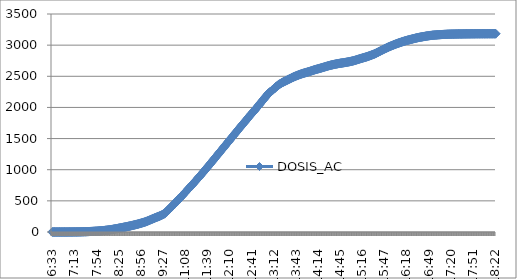
| Category | DOSIS_AC |
|---|---|
| 0.27291666666666664 | 0.014 |
| 0.2736111111111111 | 0.028 |
| 0.2743055555555555 | 0.042 |
| 0.275 | 0.056 |
| 0.27569444444444446 | 0.07 |
| 0.27638888888888885 | 0.084 |
| 0.27708333333333335 | 0.098 |
| 0.2777777777777778 | 0.112 |
| 0.27847222222222223 | 0.126 |
| 0.2791666666666667 | 0.14 |
| 0.2798611111111111 | 0.154 |
| 0.28055555555555556 | 0.182 |
| 0.28125 | 0.21 |
| 0.28194444444444444 | 0.238 |
| 0.2826388888888889 | 0.266 |
| 0.2833333333333333 | 0.294 |
| 0.28402777777777777 | 0.322 |
| 0.2847222222222222 | 0.349 |
| 0.28541666666666665 | 0.377 |
| 0.28611111111111115 | 0.419 |
| 0.2923611111111111 | 0.475 |
| 0.29305555555555557 | 0.545 |
| 0.29375 | 0.615 |
| 0.29444444444444445 | 0.685 |
| 0.2951388888888889 | 0.755 |
| 0.29583333333333334 | 0.839 |
| 0.2972222222222222 | 0.923 |
| 0.29791666666666666 | 1.021 |
| 0.2986111111111111 | 1.118 |
| 0.29930555555555555 | 1.23 |
| 0.3 | 1.342 |
| 0.30069444444444443 | 1.454 |
| 0.3013888888888889 | 1.58 |
| 0.3020833333333333 | 1.706 |
| 0.30277777777777776 | 1.831 |
| 0.3090277777777778 | 2.041 |
| 0.30972222222222223 | 2.265 |
| 0.3104166666666667 | 2.488 |
| 0.3111111111111111 | 2.726 |
| 0.31180555555555556 | 2.978 |
| 0.3125 | 3.243 |
| 0.31319444444444444 | 3.509 |
| 0.3138888888888889 | 3.789 |
| 0.3145833333333333 | 4.082 |
| 0.31527777777777777 | 4.39 |
| 0.3159722222222222 | 4.711 |
| 0.31666666666666665 | 5.047 |
| 0.31736111111111115 | 5.396 |
| 0.31805555555555554 | 5.774 |
| 0.3201388888888889 | 6.193 |
| 0.32083333333333336 | 6.627 |
| 0.3215277777777778 | 7.074 |
| 0.32222222222222224 | 7.549 |
| 0.3229166666666667 | 8.052 |
| 0.3236111111111111 | 8.584 |
| 0.32430555555555557 | 9.143 |
| 0.325 | 9.73 |
| 0.32569444444444445 | 10.331 |
| 0.3263888888888889 | 10.96 |
| 0.32708333333333334 | 11.617 |
| 0.3277777777777778 | 12.302 |
| 0.3284722222222222 | 13.029 |
| 0.32916666666666666 | 13.784 |
| 0.3298611111111111 | 14.581 |
| 0.33055555555555555 | 15.406 |
| 0.33125 | 16.273 |
| 0.33194444444444443 | 17.181 |
| 0.3326388888888889 | 18.132 |
| 0.3333333333333333 | 19.125 |
| 0.3340277777777778 | 20.173 |
| 0.3347222222222222 | 21.264 |
| 0.3354166666666667 | 22.396 |
| 0.3361111111111111 | 23.57 |
| 0.3368055555555556 | 24.787 |
| 0.3375 | 26.045 |
| 0.33819444444444446 | 27.359 |
| 0.33888888888888885 | 28.715 |
| 0.33958333333333335 | 30.113 |
| 0.34027777777777773 | 31.553 |
| 0.34097222222222223 | 33.063 |
| 0.3416666666666666 | 34.656 |
| 0.3423611111111111 | 36.32 |
| 0.3430555555555555 | 38.054 |
| 0.34375 | 39.843 |
| 0.3444444444444445 | 41.702 |
| 0.3451388888888889 | 43.618 |
| 0.3458333333333334 | 45.575 |
| 0.34652777777777777 | 47.574 |
| 0.34722222222222227 | 49.601 |
| 0.34791666666666665 | 51.684 |
| 0.34861111111111115 | 53.823 |
| 0.34930555555555554 | 55.99 |
| 0.35 | 58.185 |
| 0.3506944444444444 | 60.422 |
| 0.3513888888888889 | 62.63 |
| 0.3520833333333333 | 64.839 |
| 0.3527777777777778 | 67.09 |
| 0.3534722222222222 | 69.383 |
| 0.3541666666666667 | 71.661 |
| 0.3548611111111111 | 73.884 |
| 0.35555555555555557 | 76.093 |
| 0.35625 | 78.316 |
| 0.35694444444444445 | 80.581 |
| 0.3576388888888889 | 82.915 |
| 0.35833333333333334 | 85.278 |
| 0.3590277777777778 | 87.683 |
| 0.3597222222222222 | 90.115 |
| 0.36041666666666666 | 92.548 |
| 0.3611111111111111 | 95.022 |
| 0.36180555555555555 | 97.594 |
| 0.3625 | 100.195 |
| 0.36319444444444443 | 102.865 |
| 0.3638888888888889 | 105.577 |
| 0.3645833333333333 | 108.331 |
| 0.3652777777777778 | 111.057 |
| 0.3659722222222222 | 113.783 |
| 0.3666666666666667 | 116.551 |
| 0.3673611111111111 | 119.375 |
| 0.3680555555555556 | 122.241 |
| 0.36875 | 125.135 |
| 0.36944444444444446 | 128.071 |
| 0.37013888888888885 | 131.188 |
| 0.37083333333333335 | 134.362 |
| 0.37152777777777773 | 137.577 |
| 0.37222222222222223 | 140.862 |
| 0.3729166666666666 | 144.288 |
| 0.3736111111111111 | 147.769 |
| 0.3743055555555555 | 151.18 |
| 0.375 | 154.633 |
| 0.3756944444444445 | 158.268 |
| 0.3763888888888889 | 162.238 |
| 0.3770833333333334 | 166.194 |
| 0.37777777777777777 | 170.598 |
| 0.37847222222222227 | 175.211 |
| 0.37916666666666665 | 179.853 |
| 0.37986111111111115 | 184.648 |
| 0.38055555555555554 | 189.513 |
| 0.38125 | 194.392 |
| 0.3819444444444444 | 199.187 |
| 0.3826388888888889 | 203.954 |
| 0.3833333333333333 | 208.805 |
| 0.3840277777777778 | 213.572 |
| 0.3847222222222222 | 218.424 |
| 0.3854166666666667 | 223.303 |
| 0.3861111111111111 | 227.776 |
| 0.38680555555555557 | 232.683 |
| 0.3875 | 237.227 |
| 0.38819444444444445 | 241.63 |
| 0.3888888888888889 | 245.992 |
| 0.38958333333333334 | 250.466 |
| 0.3902777777777778 | 255.093 |
| 0.3909722222222222 | 260.294 |
| 0.39166666666666666 | 265.62 |
| 0.3923611111111111 | 270.639 |
| 0.39305555555555555 | 276.496 |
| 0.39375 | 282.326 |
| 0.39444444444444443 | 287.806 |
| 0.3951388888888889 | 293.748 |
| 0.4444444444444444 | 304.75 |
| 0.4451388888888889 | 315.808 |
| 0.4458333333333333 | 326.908 |
| 0.4465277777777778 | 338.092 |
| 0.4472222222222222 | 349.36 |
| 0.4479166666666667 | 360.698 |
| 0.4486111111111111 | 372.064 |
| 0.44930555555555557 | 383.457 |
| 0.45 | 394.949 |
| 0.45069444444444445 | 406.468 |
| 0.4513888888888889 | 418.016 |
| 0.45208333333333334 | 429.633 |
| 0.4527777777777778 | 441.293 |
| 0.4534722222222222 | 452.994 |
| 0.45416666666666666 | 464.779 |
| 0.4548611111111111 | 476.62 |
| 0.45555555555555555 | 488.517 |
| 0.45625 | 500.47 |
| 0.45694444444444443 | 512.479 |
| 0.4576388888888889 | 524.558 |
| 0.4583333333333333 | 536.692 |
| 0.4590277777777778 | 548.855 |
| 0.4597222222222222 | 561.045 |
| 0.4604166666666667 | 573.278 |
| 0.4611111111111111 | 585.566 |
| 0.4618055555555556 | 597.855 |
| 0.4625 | 610.129 |
| 0.46319444444444446 | 622.459 |
| 0.46388888888888885 | 634.846 |
| 0.46458333333333335 | 647.288 |
| 0.46527777777777773 | 659.772 |
| 0.46597222222222223 | 672.242 |
| 0.4666666666666666 | 684.712 |
| 0.4673611111111111 | 697.141 |
| 0.4680555555555555 | 709.541 |
| 0.46875 | 721.997 |
| 0.4694444444444445 | 734.551 |
| 0.4701388888888889 | 747.259 |
| 0.4708333333333334 | 760.051 |
| 0.47152777777777777 | 772.87 |
| 0.47222222222222227 | 785.676 |
| 0.47291666666666665 | 798.454 |
| 0.47361111111111115 | 811.217 |
| 0.47430555555555554 | 824.023 |
| 0.475 | 836.871 |
| 0.4756944444444444 | 849.774 |
| 0.4763888888888889 | 862.79 |
| 0.4770833333333333 | 875.903 |
| 0.4777777777777778 | 889.058 |
| 0.4784722222222222 | 902.185 |
| 0.4791666666666667 | 915.382 |
| 0.4798611111111111 | 928.719 |
| 0.48055555555555557 | 942.126 |
| 0.48125 | 955.589 |
| 0.48194444444444445 | 969.108 |
| 0.4826388888888889 | 982.696 |
| 0.48333333333333334 | 996.327 |
| 0.4840277777777778 | 1009.985 |
| 0.4847222222222222 | 1023.63 |
| 0.48541666666666666 | 1037.302 |
| 0.4861111111111111 | 1050.988 |
| 0.48680555555555555 | 1064.633 |
| 0.4875 | 1078.319 |
| 0.48819444444444443 | 1092.201 |
| 0.4888888888888889 | 1106.154 |
| 0.4895833333333333 | 1120.078 |
| 0.4902777777777778 | 1134.016 |
| 0.4909722222222222 | 1147.996 |
| 0.4916666666666667 | 1161.976 |
| 0.4923611111111111 | 1175.956 |
| 0.4930555555555556 | 1189.936 |
| 0.49375 | 1203.916 |
| 0.49444444444444446 | 1217.896 |
| 0.49513888888888885 | 1231.876 |
| 0.49583333333333335 | 1245.856 |
| 0.49652777777777773 | 1259.836 |
| 0.49722222222222223 | 1273.816 |
| 0.4979166666666666 | 1287.796 |
| 0.4986111111111111 | 1301.776 |
| 0.4993055555555555 | 1315.756 |
| 0.5 | 1329.736 |
| 0.5006944444444444 | 1343.716 |
| 0.5013888888888889 | 1357.696 |
| 0.5020833333333333 | 1371.676 |
| 0.5027777777777778 | 1385.656 |
| 0.5034722222222222 | 1399.636 |
| 0.5041666666666667 | 1413.616 |
| 0.5048611111111111 | 1427.596 |
| 0.5055555555555555 | 1441.576 |
| 0.50625 | 1455.556 |
| 0.5069444444444444 | 1469.536 |
| 0.5076388888888889 | 1483.516 |
| 0.5083333333333333 | 1497.496 |
| 0.5090277777777777 | 1511.476 |
| 0.5097222222222222 | 1525.456 |
| 0.5104166666666666 | 1539.436 |
| 0.5111111111111112 | 1553.416 |
| 0.5118055555555555 | 1567.396 |
| 0.5125 | 1581.376 |
| 0.5131944444444444 | 1595.356 |
| 0.513888888888889 | 1609.336 |
| 0.5145833333333333 | 1623.316 |
| 0.5152777777777778 | 1637.296 |
| 0.5159722222222222 | 1651.276 |
| 0.5166666666666667 | 1665.256 |
| 0.517361111111111 | 1679.236 |
| 0.5180555555555556 | 1693.216 |
| 0.51875 | 1707.196 |
| 0.5194444444444445 | 1721.176 |
| 0.5201388888888888 | 1735.156 |
| 0.5208333333333334 | 1748.283 |
| 0.5215277777777778 | 1759.956 |
| 0.5222222222222223 | 1773.936 |
| 0.5229166666666667 | 1787.916 |
| 0.5236111111111111 | 1801.896 |
| 0.5243055555555556 | 1815.876 |
| 0.525 | 1829.856 |
| 0.5256944444444445 | 1843.836 |
| 0.5263888888888889 | 1857.816 |
| 0.5270833333333333 | 1871.796 |
| 0.5277777777777778 | 1885.776 |
| 0.5284722222222222 | 1898.596 |
| 0.5291666666666667 | 1909.598 |
| 0.5298611111111111 | 1923.41 |
| 0.5305555555555556 | 1935.978 |
| 0.53125 | 1949.189 |
| 0.5319444444444444 | 1963.169 |
| 0.5326388888888889 | 1977.149 |
| 0.5333333333333333 | 1991.129 |
| 0.5340277777777778 | 2005.109 |
| 0.5347222222222222 | 2019.089 |
| 0.5354166666666667 | 2033.069 |
| 0.5361111111111111 | 2047.049 |
| 0.5368055555555555 | 2061.029 |
| 0.5375 | 2075.009 |
| 0.5381944444444444 | 2088.989 |
| 0.5388888888888889 | 2102.969 |
| 0.5395833333333333 | 2116.949 |
| 0.5402777777777777 | 2130.929 |
| 0.5409722222222222 | 2144.909 |
| 0.5416666666666666 | 2158.736 |
| 0.5423611111111112 | 2172.576 |
| 0.5430555555555555 | 2186.556 |
| 0.54375 | 2200.536 |
| 0.5444444444444444 | 2214.516 |
| 0.545138888888889 | 2227.126 |
| 0.5458333333333333 | 2237.485 |
| 0.5465277777777778 | 2247.243 |
| 0.5472222222222222 | 2256.61 |
| 0.5479166666666667 | 2265.739 |
| 0.548611111111111 | 2274.7 |
| 0.5493055555555556 | 2283.759 |
| 0.55 | 2294.076 |
| 0.5506944444444445 | 2304.044 |
| 0.5513888888888888 | 2314.319 |
| 0.5520833333333334 | 2326.09 |
| 0.5527777777777778 | 2336.645 |
| 0.5534722222222223 | 2345.956 |
| 0.5541666666666667 | 2354.917 |
| 0.5548611111111111 | 2363.109 |
| 0.5555555555555556 | 2370.882 |
| 0.55625 | 2378.348 |
| 0.5569444444444445 | 2385.505 |
| 0.5576388888888889 | 2392.286 |
| 0.5583333333333333 | 2398.744 |
| 0.5590277777777778 | 2404.854 |
| 0.5597222222222222 | 2410.683 |
| 0.5604166666666667 | 2416.401 |
| 0.5611111111111111 | 2422.119 |
| 0.5618055555555556 | 2427.865 |
| 0.5625 | 2433.61 |
| 0.5631944444444444 | 2439.328 |
| 0.5638888888888889 | 2444.976 |
| 0.5645833333333333 | 2450.568 |
| 0.5652777777777778 | 2456.118 |
| 0.5659722222222222 | 2461.668 |
| 0.5666666666666667 | 2467.26 |
| 0.5673611111111111 | 2472.866 |
| 0.5680555555555555 | 2478.402 |
| 0.56875 | 2483.813 |
| 0.5694444444444444 | 2489.083 |
| 0.5701388888888889 | 2494.214 |
| 0.5708333333333333 | 2499.191 |
| 0.5715277777777777 | 2504.014 |
| 0.5722222222222222 | 2508.697 |
| 0.5729166666666666 | 2513.241 |
| 0.5736111111111112 | 2517.658 |
| 0.5743055555555555 | 2521.978 |
| 0.575 | 2526.2 |
| 0.5756944444444444 | 2530.324 |
| 0.576388888888889 | 2534.364 |
| 0.5770833333333333 | 2538.321 |
| 0.5777777777777778 | 2542.165 |
| 0.5784722222222222 | 2545.87 |
| 0.5791666666666667 | 2549.421 |
| 0.579861111111111 | 2552.846 |
| 0.5805555555555556 | 2556.187 |
| 0.58125 | 2559.486 |
| 0.5819444444444445 | 2562.786 |
| 0.5826388888888888 | 2566.127 |
| 0.5833333333333334 | 2569.51 |
| 0.5840277777777778 | 2572.949 |
| 0.5847222222222223 | 2576.472 |
| 0.5854166666666667 | 2580.079 |
| 0.5861111111111111 | 2583.784 |
| 0.5868055555555556 | 2587.558 |
| 0.5875 | 2591.347 |
| 0.5881944444444445 | 2595.121 |
| 0.5888888888888889 | 2598.812 |
| 0.5895833333333333 | 2602.405 |
| 0.5902777777777778 | 2605.872 |
| 0.5909722222222222 | 2609.241 |
| 0.5916666666666667 | 2612.554 |
| 0.5923611111111111 | 2615.84 |
| 0.5930555555555556 | 2619.097 |
| 0.59375 | 2622.34 |
| 0.5944444444444444 | 2625.556 |
| 0.5951388888888889 | 2628.757 |
| 0.5958333333333333 | 2631.973 |
| 0.5965277777777778 | 2635.244 |
| 0.5972222222222222 | 2638.585 |
| 0.5979166666666667 | 2641.996 |
| 0.5986111111111111 | 2645.463 |
| 0.5993055555555555 | 2648.972 |
| 0.6 | 2652.495 |
| 0.6006944444444444 | 2656.004 |
| 0.6013888888888889 | 2659.471 |
| 0.6020833333333333 | 2662.868 |
| 0.6027777777777777 | 2666.168 |
| 0.6034722222222222 | 2669.355 |
| 0.6041666666666666 | 2672.417 |
| 0.6048611111111112 | 2675.381 |
| 0.6055555555555555 | 2678.246 |
| 0.60625 | 2681.028 |
| 0.6069444444444444 | 2683.741 |
| 0.607638888888889 | 2686.145 |
| 0.6083333333333333 | 2688.745 |
| 0.6090277777777778 | 2691.276 |
| 0.6097222222222222 | 2693.736 |
| 0.6104166666666667 | 2696.127 |
| 0.611111111111111 | 2698.434 |
| 0.6118055555555556 | 2700.67 |
| 0.6125 | 2702.837 |
| 0.6131944444444445 | 2704.92 |
| 0.6138888888888888 | 2706.919 |
| 0.6145833333333334 | 2708.835 |
| 0.6152777777777778 | 2710.666 |
| 0.6159722222222223 | 2712.442 |
| 0.6166666666666667 | 2714.189 |
| 0.6173611111111111 | 2715.937 |
| 0.6180555555555556 | 2717.712 |
| 0.61875 | 2719.543 |
| 0.6194444444444445 | 2721.431 |
| 0.6201388888888889 | 2723.388 |
| 0.6208333333333333 | 2725.415 |
| 0.6215277777777778 | 2727.498 |
| 0.6222222222222222 | 2729.637 |
| 0.6229166666666667 | 2731.832 |
| 0.6236111111111111 | 2734.097 |
| 0.6243055555555556 | 2736.431 |
| 0.625 | 2738.85 |
| 0.6256944444444444 | 2741.38 |
| 0.6263888888888889 | 2744.05 |
| 0.6270833333333333 | 2746.888 |
| 0.6277777777777778 | 2749.908 |
| 0.6284722222222222 | 2753.095 |
| 0.6291666666666667 | 2756.423 |
| 0.6298611111111111 | 2759.862 |
| 0.6305555555555555 | 2763.371 |
| 0.63125 | 2766.936 |
| 0.6319444444444444 | 2770.542 |
| 0.6326388888888889 | 2774.163 |
| 0.6333333333333333 | 2777.77 |
| 0.6340277777777777 | 2781.321 |
| 0.6347222222222222 | 2784.816 |
| 0.6354166666666666 | 2788.255 |
| 0.6361111111111112 | 2791.652 |
| 0.6368055555555555 | 2795.021 |
| 0.6375 | 2798.363 |
| 0.6381944444444444 | 2801.676 |
| 0.638888888888889 | 2805.003 |
| 0.6395833333333333 | 2808.386 |
| 0.6402777777777778 | 2811.853 |
| 0.6409722222222222 | 2815.488 |
| 0.6416666666666667 | 2819.319 |
| 0.642361111111111 | 2823.359 |
| 0.6430555555555556 | 2827.525 |
| 0.64375 | 2831.747 |
| 0.6444444444444445 | 2835.955 |
| 0.6451388888888888 | 2840.163 |
| 0.6458333333333334 | 2844.427 |
| 0.6465277777777778 | 2848.775 |
| 0.6472222222222223 | 2853.192 |
| 0.6479166666666667 | 2857.666 |
| 0.6486111111111111 | 2862.671 |
| 0.6493055555555556 | 2868.36 |
| 0.65 | 2874.232 |
| 0.6506944444444445 | 2879.992 |
| 0.6513888888888889 | 2885.206 |
| 0.6520833333333333 | 2891.092 |
| 0.6527777777777778 | 2897.159 |
| 0.6534722222222222 | 2903.087 |
| 0.6541666666666667 | 2908.986 |
| 0.6548611111111111 | 2914.872 |
| 0.6555555555555556 | 2920.758 |
| 0.65625 | 2926.657 |
| 0.6569444444444444 | 2932.473 |
| 0.6576388888888889 | 2938.121 |
| 0.6583333333333333 | 2943.643 |
| 0.6590277777777778 | 2949.081 |
| 0.6597222222222222 | 2954.449 |
| 0.6604166666666667 | 2959.734 |
| 0.6611111111111111 | 2964.92 |
| 0.6618055555555555 | 2970.009 |
| 0.6625 | 2975.014 |
| 0.6631944444444444 | 2979.907 |
| 0.6638888888888889 | 2984.688 |
| 0.6645833333333333 | 2989.385 |
| 0.6652777777777777 | 2994.041 |
| 0.6659722222222222 | 2998.682 |
| 0.6666666666666666 | 3003.323 |
| 0.6673611111111111 | 3007.937 |
| 0.6680555555555556 | 3012.48 |
| 0.66875 | 3016.954 |
| 0.6694444444444444 | 3021.344 |
| 0.6701388888888888 | 3025.622 |
| 0.6708333333333334 | 3029.732 |
| 0.6715277777777778 | 3033.688 |
| 0.6722222222222222 | 3037.63 |
| 0.6729166666666666 | 3041.503 |
| 0.6736111111111112 | 3045.361 |
| 0.6743055555555556 | 3049.192 |
| 0.675 | 3052.966 |
| 0.6756944444444444 | 3056.685 |
| 0.6763888888888889 | 3060.362 |
| 0.6770833333333334 | 3063.983 |
| 0.6777777777777777 | 3067.548 |
| 0.6784722222222223 | 3070.945 |
| 0.6791666666666667 | 3074.16 |
| 0.6798611111111111 | 3077.208 |
| 0.6805555555555555 | 3080.185 |
| 0.68125 | 3083.163 |
| 0.6819444444444445 | 3086.071 |
| 0.6826388888888889 | 3088.965 |
| 0.6833333333333332 | 3091.887 |
| 0.6840277777777778 | 3094.906 |
| 0.6847222222222222 | 3097.87 |
| 0.6854166666666667 | 3100.82 |
| 0.686111111111111 | 3103.742 |
| 0.6868055555555556 | 3106.636 |
| 0.6875 | 3109.46 |
| 0.6881944444444444 | 3112.242 |
| 0.688888888888889 | 3114.954 |
| 0.6895833333333333 | 3117.596 |
| 0.6902777777777778 | 3120.182 |
| 0.6909722222222222 | 3122.657 |
| 0.6916666666666668 | 3124.893 |
| 0.6923611111111111 | 3127.074 |
| 0.6930555555555555 | 3129.227 |
| 0.69375 | 3131.366 |
| 0.6944444444444445 | 3133.435 |
| 0.6951388888888889 | 3135.462 |
| 0.6958333333333333 | 3137.448 |
| 0.6965277777777777 | 3139.433 |
| 0.6972222222222223 | 3141.474 |
| 0.6979166666666666 | 3143.473 |
| 0.6986111111111111 | 3145.402 |
| 0.6993055555555556 | 3147.248 |
| 0.7 | 3149.009 |
| 0.7006944444444444 | 3150.673 |
| 0.7013888888888888 | 3152.28 |
| 0.7020833333333334 | 3153.832 |
| 0.7027777777777778 | 3155.328 |
| 0.7034722222222222 | 3156.74 |
| 0.7041666666666666 | 3158.012 |
| 0.7048611111111112 | 3159.214 |
| 0.7055555555555556 | 3160.361 |
| 0.70625 | 3161.451 |
| 0.7069444444444444 | 3162.472 |
| 0.7076388888888889 | 3163.436 |
| 0.7083333333333334 | 3164.359 |
| 0.7090277777777777 | 3165.254 |
| 0.7097222222222223 | 3166.107 |
| 0.7104166666666667 | 3166.931 |
| 0.7111111111111111 | 3167.728 |
| 0.7118055555555555 | 3168.497 |
| 0.7125 | 3169.238 |
| 0.7131944444444445 | 3169.951 |
| 0.7138888888888889 | 3170.636 |
| 0.7145833333333332 | 3171.293 |
| 0.7152777777777778 | 3171.922 |
| 0.7159722222222222 | 3172.509 |
| 0.7166666666666667 | 3173.069 |
| 0.717361111111111 | 3173.6 |
| 0.7180555555555556 | 3174.103 |
| 0.71875 | 3174.578 |
| 0.7194444444444444 | 3175.04 |
| 0.720138888888889 | 3175.473 |
| 0.7208333333333333 | 3175.879 |
| 0.7215277777777778 | 3176.27 |
| 0.7222222222222222 | 3176.633 |
| 0.7229166666666668 | 3176.969 |
| 0.7236111111111111 | 3177.277 |
| 0.7243055555555555 | 3177.57 |
| 0.725 | 3177.836 |
| 0.7256944444444445 | 3178.087 |
| 0.7263888888888889 | 3178.325 |
| 0.7270833333333333 | 3178.549 |
| 0.7277777777777777 | 3178.772 |
| 0.7284722222222223 | 3178.982 |
| 0.7291666666666666 | 3179.178 |
| 0.7298611111111111 | 3179.374 |
| 0.7305555555555556 | 3179.555 |
| 0.73125 | 3179.737 |
| 0.7319444444444444 | 3179.919 |
| 0.7326388888888888 | 3180.101 |
| 0.7333333333333334 | 3180.268 |
| 0.7340277777777778 | 3180.436 |
| 0.7347222222222222 | 3180.604 |
| 0.7354166666666666 | 3180.758 |
| 0.7361111111111112 | 3180.911 |
| 0.7368055555555556 | 3181.065 |
| 0.7375 | 3181.205 |
| 0.7381944444444444 | 3181.345 |
| 0.7388888888888889 | 3181.471 |
| 0.7395833333333334 | 3181.596 |
| 0.7402777777777777 | 3181.722 |
| 0.7409722222222223 | 3181.848 |
| 0.7416666666666667 | 3181.974 |
| 0.7423611111111111 | 3182.1 |
| 0.7430555555555555 | 3182.211 |
| 0.74375 | 3182.323 |
| 0.7444444444444445 | 3182.435 |
| 0.7451388888888889 | 3182.533 |
| 0.7458333333333332 | 3182.631 |
| 0.7465277777777778 | 3182.715 |
| 0.7472222222222222 | 3182.799 |
| 0.7479166666666667 | 3182.869 |
| 0.748611111111111 | 3182.938 |
| 0.7493055555555556 | 3182.994 |
| 0.75 | 3183.05 |
| 0.7506944444444444 | 3183.106 |
| 0.751388888888889 | 3183.148 |
| 0.7520833333333333 | 3183.19 |
| 0.7527777777777778 | 3183.232 |
| 0.7534722222222222 | 3183.274 |
| 0.7541666666666668 | 3183.302 |
| 0.7548611111111111 | 3183.33 |
| 0.7555555555555555 | 3183.358 |
| 0.75625 | 3183.386 |
| 0.7569444444444445 | 3183.414 |
| 0.7576388888888889 | 3183.442 |
| 0.7583333333333333 | 3183.456 |
| 0.7590277777777777 | 3183.47 |
| 0.7597222222222223 | 3183.484 |
| 0.7604166666666666 | 3183.498 |
| 0.7611111111111111 | 3183.512 |
| 0.7618055555555556 | 3183.526 |
| 0.7625 | 3183.54 |
| 0.7631944444444444 | 3183.554 |
| 0.7638888888888888 | 3183.568 |
| 0.7645833333333334 | 3183.582 |
| 0.7652777777777778 | 3183.596 |
| 0.7659722222222222 | 3183.609 |